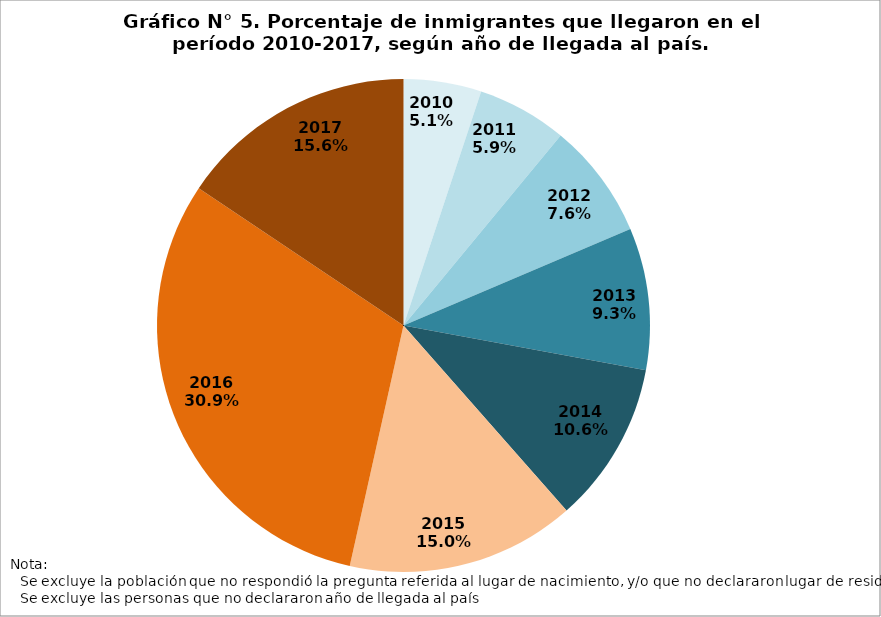
| Category | Series 0 |
|---|---|
| 2010.0 | 0.051 |
| 2011.0 | 0.059 |
| 2012.0 | 0.076 |
| 2013.0 | 0.093 |
| 2014.0 | 0.106 |
| 2015.0 | 0.15 |
| 2016.0 | 0.309 |
| 2017.0 | 0.156 |